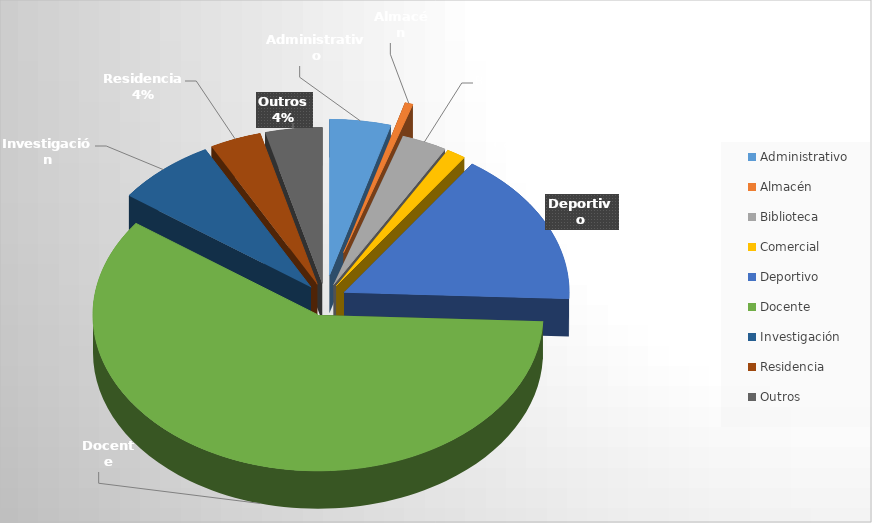
| Category | Series 0 |
|---|---|
| Administrativo | 19628.69 |
| Almacén | 2586 |
| Biblioteca  | 14583.73 |
| Comercial | 6145.88 |
| Deportivo | 71528.42 |
| Docente | 264918.1 |
| Investigación | 32254.05 |
| Residencia  | 16488 |
| Outros  | 18238.21 |